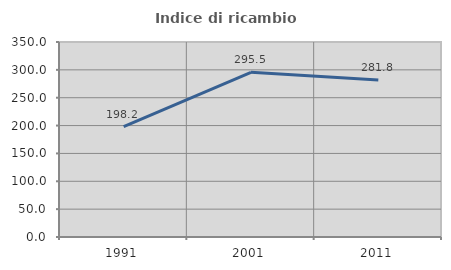
| Category | Indice di ricambio occupazionale  |
|---|---|
| 1991.0 | 198.182 |
| 2001.0 | 295.528 |
| 2011.0 | 281.818 |